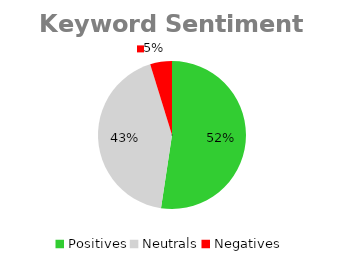
| Category | Keyword Sentiment Total |
|---|---|
| Positives | 55 |
| Neutrals | 45 |
| Negatives | 5 |